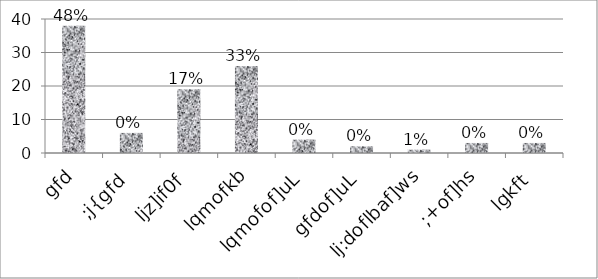
| Category | Series 0 |
|---|---|
| gfd | 38 |
| ;j{gfd | 6 |
| ljz]if0f | 19 |
| lqmofkb | 26 |
| lqmofof]uL | 4 |
| gfdof]uL | 2 |
| lj:doflbaf]ws | 1 |
| ;+of]hs | 3 |
| lgkft | 3 |